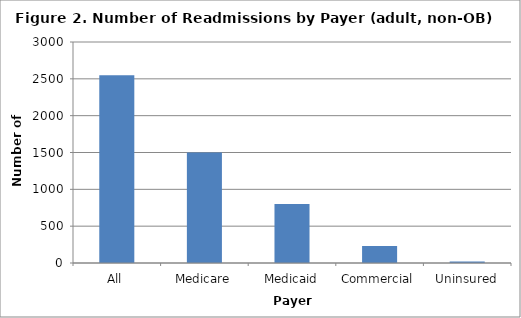
| Category | Number of Readmissions |
|---|---|
| All | 2550 |
| Medicare | 1500 |
| Medicaid | 800 |
| Commercial | 230 |
| Uninsured | 20 |